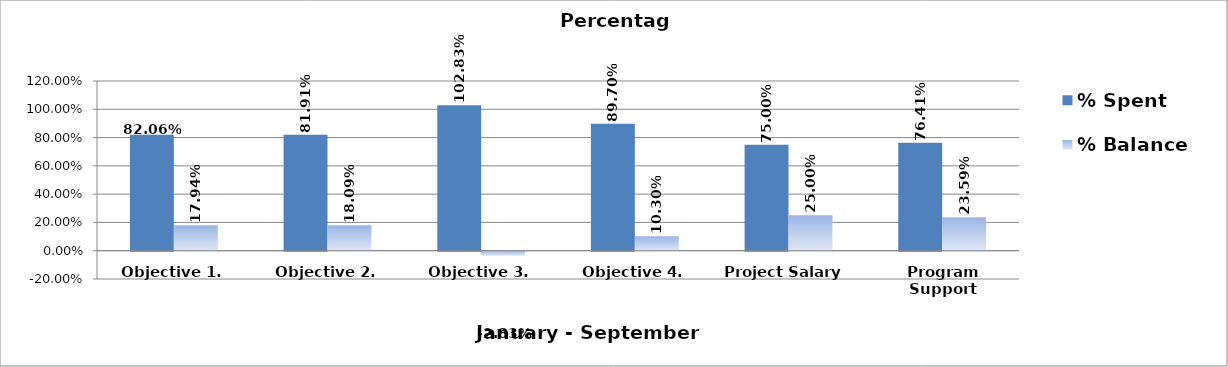
| Category | % Spent  | % Balance  |
|---|---|---|
| Objective 1. | 0.821 | 0.179 |
| Objective 2. | 0.819 | 0.181 |
| Objective 3. | 1.028 | -0.028 |
| Objective 4. | 0.897 | 0.103 |
| Project Salary  | 0.75 | 0.25 |
| Program Support | 0.764 | 0.236 |